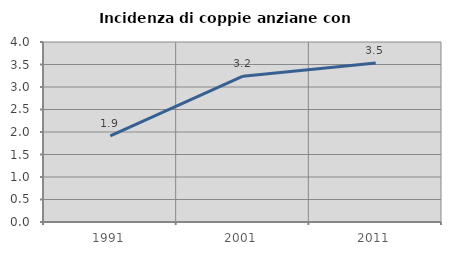
| Category | Incidenza di coppie anziane con figli |
|---|---|
| 1991.0 | 1.912 |
| 2001.0 | 3.241 |
| 2011.0 | 3.534 |